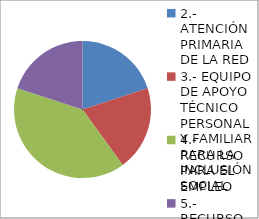
| Category | Series 0 |
|---|---|
| 2.- ATENCIÓN PRIMARIA DE LA RED | 1 |
| 3.- EQUIPO DE APOYO TÉCNICO PERSONAL Y FAMILIAR PARA LA INCLUSIÓN SOCIAL | 1 |
| 4.- RECURSO PARA EL EMPLEO | 2 |
| 5.- RECURSO DE ALOJAMIENTO PARA LA INCLUSIÓN | 1 |